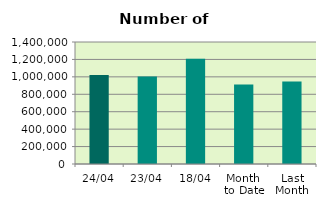
| Category | Series 0 |
|---|---|
| 24/04 | 1020904 |
| 23/04 | 1004942 |
| 18/04 | 1208734 |
| Month 
to Date | 913196.125 |
| Last
Month | 947588.19 |